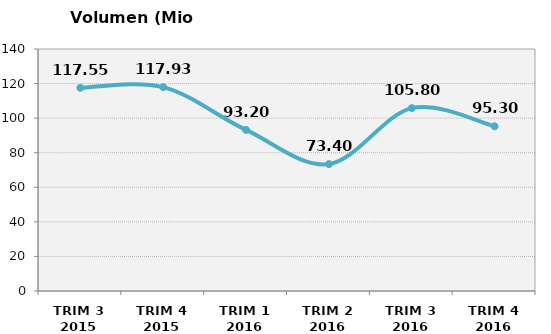
| Category | Volumen (Mio consumiciones) |
|---|---|
| TRIM 3 2015 | 117.549 |
| TRIM 4 2015 | 117.93 |
| TRIM 1 2016 | 93.2 |
| TRIM 2 2016 | 73.4 |
| TRIM 3 2016 | 105.8 |
| TRIM 4 2016 | 95.3 |